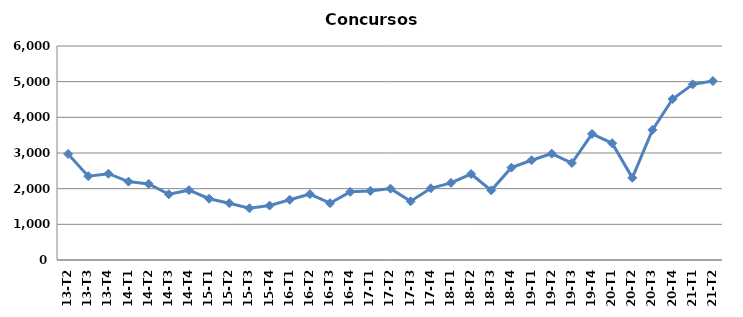
| Category | Concursos |
|---|---|
| 13-T2 | 2973 |
| 13-T3 | 2350 |
| 13-T4 | 2419 |
| 14-T1 | 2198 |
| 14-T2 | 2133 |
| 14-T3 | 1843 |
| 14-T4 | 1958 |
| 15-T1 | 1718 |
| 15-T2 | 1593 |
| 15-T3 | 1451 |
| 15-T4 | 1526 |
| 16-T1 | 1689 |
| 16-T2 | 1847 |
| 16-T3 | 1593 |
| 16-T4 | 1911 |
| 17-T1 | 1937 |
| 17-T2 | 2001 |
| 17-T3 | 1645 |
| 17-T4 | 2011 |
| 18-T1 | 2162 |
| 18-T2 | 2410 |
| 18-T3 | 1953 |
| 18-T4 | 2590 |
| 19-T1 | 2796 |
| 19-T2 | 2982 |
| 19-T3 | 2719 |
| 19-T4 | 3534 |
| 20-T1 | 3274 |
| 20-T2 | 2305 |
| 20-T3 | 3649 |
| 20-T4 | 4513 |
| 21-T1 | 4925 |
| 21-T2 | 5017 |